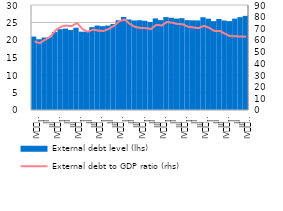
| Category | External debt level (lhs) |
|---|---|
| IV
2008 | 20.982 |
| I | 20.211 |
| II | 20.713 |
| III | 20.839 |
| IV
2009 | 22.272 |
| I | 23.09 |
| II | 23.254 |
| III | 22.861 |
| IV
2010 | 23.509 |
| I | 22.384 |
| II | 22.4 |
| III | 23.676 |
| IV
2011 | 24.123 |
| I | 23.947 |
| II | 24.124 |
| III | 24.565 |
| IV
2012 | 25.645 |
| I | 26.582 |
| II | 25.858 |
| III | 25.582 |
| IV
2013 | 25.644 |
| I | 25.497 |
| II | 25.144 |
| III | 26.171 |
| IV
2014 | 25.679 |
| I | 26.552 |
| II | 26.348 |
| III | 26.111 |
| IV
2015 | 26.234 |
| I | 25.682 |
| II | 25.621 |
| III | 25.603 |
| IV
2016 | 26.494 |
| I | 26.091 |
| II | 25.389 |
| III | 25.999 |
| IV
2017 | 25.578 |
| I | 25.392 |
| II | 26.101 |
| III | 26.524 |
| IV
2018 | 26.901 |